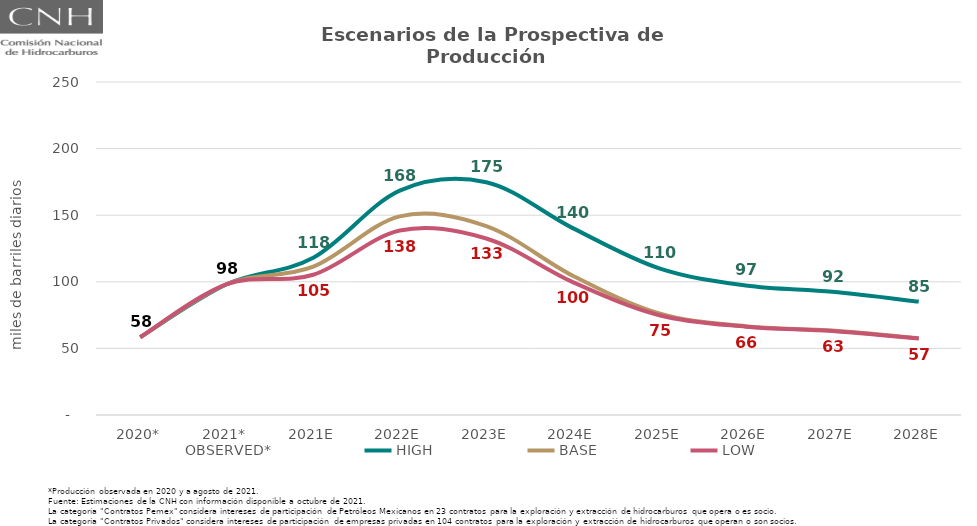
| Category | OBSERVED* | HIGH | BASE | LOW |
|---|---|---|---|---|
| 2020* | 58.422 | 58.422 | 58.422 | 58.422 |
| 2021* | 98.178 | 98.178 | 98.178 | 98.178 |
| 2021E | 118.061 | 118.061 | 111.398 | 105.272 |
| 2022E | 168.483 | 168.483 | 149.117 | 138.49 |
| 2023E | 174.714 | 174.714 | 141.852 | 132.523 |
| 2024E | 140.316 | 140.316 | 104.59 | 99.791 |
| 2025E | 110.091 | 110.091 | 76.217 | 74.884 |
| 2026E | 97.226 | 97.226 | 66.704 | 66.319 |
| 2027E | 92.455 | 92.455 | 63.356 | 63.017 |
| 2028E | 85.132 | 85.132 | 57.555 | 57.388 |